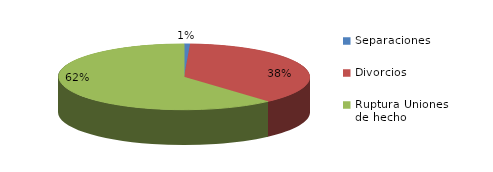
| Category | Series 0 |
|---|---|
| Separaciones | 26 |
| Divorcios | 1272 |
| Ruptura Uniones de hecho | 2082 |